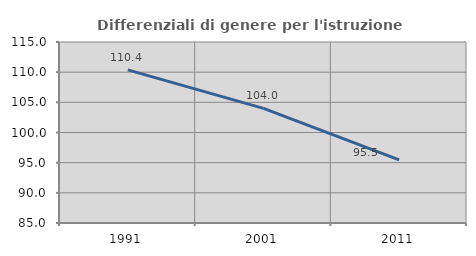
| Category | Differenziali di genere per l'istruzione superiore |
|---|---|
| 1991.0 | 110.387 |
| 2001.0 | 103.991 |
| 2011.0 | 95.465 |